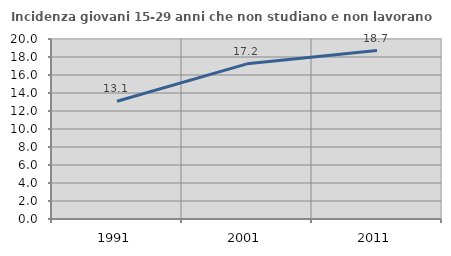
| Category | Incidenza giovani 15-29 anni che non studiano e non lavorano  |
|---|---|
| 1991.0 | 13.082 |
| 2001.0 | 17.241 |
| 2011.0 | 18.718 |